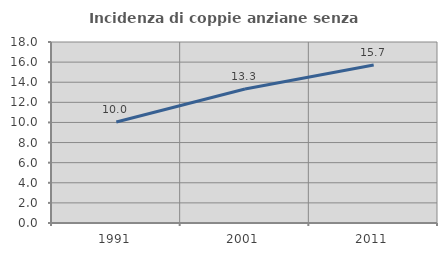
| Category | Incidenza di coppie anziane senza figli  |
|---|---|
| 1991.0 | 10.046 |
| 2001.0 | 13.325 |
| 2011.0 | 15.72 |